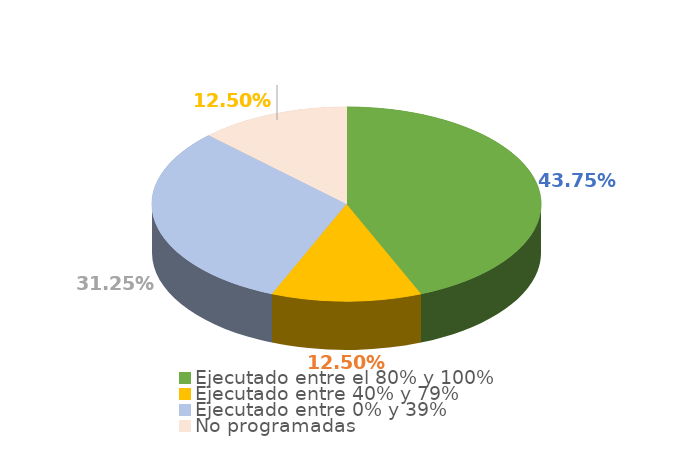
| Category | Series 0 |
|---|---|
| Ejecutado entre el 80% y 100% | 0.438 |
| Ejecutado entre 40% y 79% | 0.125 |
| Ejecutado entre 0% y 39% | 0.312 |
| No programadas | 0.125 |